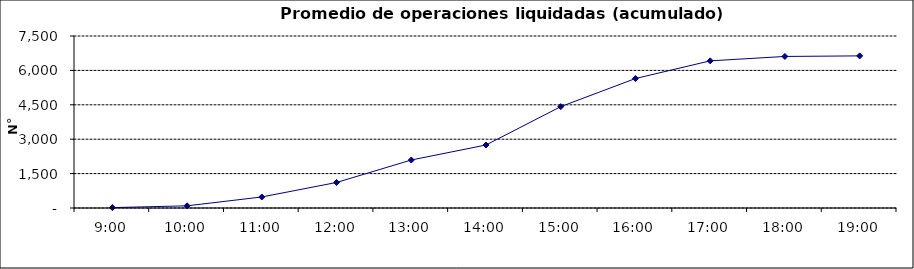
| Category | Promedio Op.Liquidadas (acumulado) |
|---|---|
| 0.375 | 17.143 |
| 0.4166666666666667 | 95.286 |
| 0.4583333333333333 | 480.476 |
| 0.5 | 1112.857 |
| 0.5416666666666666 | 2092.571 |
| 0.5833333333333334 | 2746.857 |
| 0.625 | 4419.238 |
| 0.6666666666666666 | 5646 |
| 0.7083333333333334 | 6416.619 |
| 0.75 | 6608.714 |
| 0.7916666666666666 | 6632.905 |